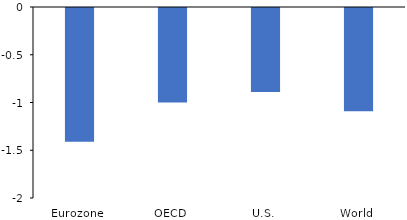
| Category | Total |
|---|---|
| Eurozone | -1.4 |
| OECD | -0.99 |
| U.S. | -0.88 |
| World | -1.08 |